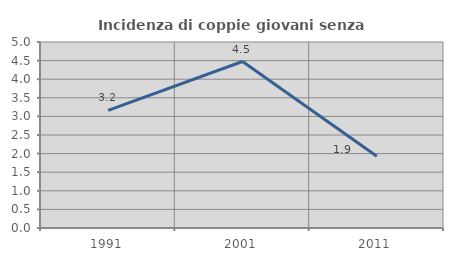
| Category | Incidenza di coppie giovani senza figli |
|---|---|
| 1991.0 | 3.161 |
| 2001.0 | 4.476 |
| 2011.0 | 1.931 |